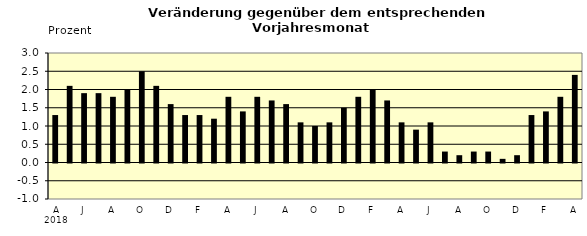
| Category | Series 0 |
|---|---|
| 0 | 1.3 |
| 1 | 2.1 |
| 2 | 1.9 |
| 3 | 1.9 |
| 4 | 1.8 |
| 5 | 2 |
| 6 | 2.5 |
| 7 | 2.1 |
| 8 | 1.6 |
| 9 | 1.3 |
| 10 | 1.3 |
| 11 | 1.2 |
| 12 | 1.8 |
| 13 | 1.4 |
| 14 | 1.8 |
| 15 | 1.7 |
| 16 | 1.6 |
| 17 | 1.1 |
| 18 | 1 |
| 19 | 1.1 |
| 20 | 1.5 |
| 21 | 1.8 |
| 22 | 2 |
| 23 | 1.7 |
| 24 | 1.1 |
| 25 | 0.9 |
| 26 | 1.1 |
| 27 | 0.3 |
| 28 | 0.2 |
| 29 | 0.3 |
| 30 | 0.3 |
| 31 | 0.1 |
| 32 | 0.2 |
| 33 | 1.3 |
| 34 | 1.4 |
| 35 | 1.8 |
| 36 | 2.4 |